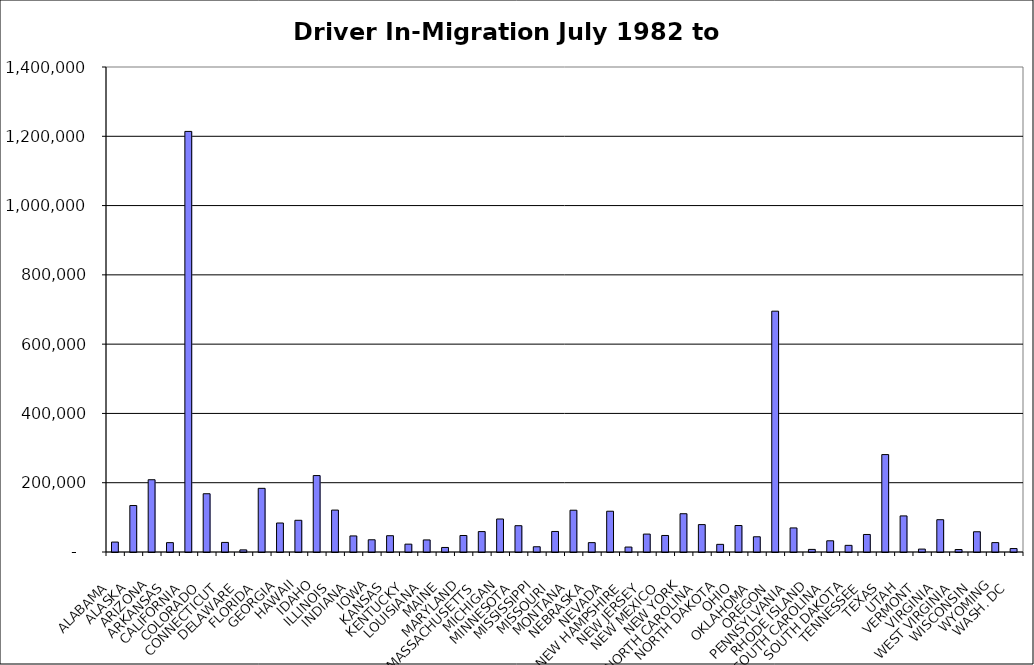
| Category | Series 0 |
|---|---|
|  ALABAMA  | 28679.5 |
|  ALASKA  | 134136.5 |
|  ARIZONA  | 208590 |
|  ARKANSAS  | 27023.5 |
|  CALIFORNIA  | 1214070.5 |
|  COLORADO  | 168181 |
|  CONNECTICUT  | 27652 |
|  DELAWARE  | 6131.5 |
|  FLORIDA  | 183751 |
|  GEORGIA  | 83703 |
|  HAWAII  | 91536.5 |
|  IDAHO  | 220633.5 |
|  ILLINOIS  | 120972.5 |
|  INDIANA  | 46371 |
|  IOWA  | 35278.5 |
|  KANSAS  | 47020.5 |
|  KENTUCKY  | 22666 |
|  LOUISIANA  | 34830.5 |
|  MAINE  | 13103.5 |
|  MARYLAND  | 47595 |
|  MASSACHUSETTS  | 58922 |
|  MICHIGAN  | 95300 |
|  MINNESOTA  | 75909.5 |
|  MISSISSIPPI  | 15127 |
|  MISSOURI  | 59276 |
|  MONTANA  | 120610 |
|  NEBRASKA  | 27030.5 |
|  NEVADA  | 117696 |
|  NEW HAMPSHIRE  | 14280.5 |
|  NEW JERSEY  | 51706 |
|  NEW MEXICO  | 47682 |
|  NEW YORK  | 110484 |
|  NORTH CAROLINA  | 79093.5 |
|  NORTH DAKOTA  | 22067.5 |
|  OHIO  | 76476.5 |
|  OKLAHOMA  | 43967 |
|  OREGON  | 695134 |
|  PENNSYLVANIA  | 69476.5 |
|  RHODE ISLAND  | 7525 |
|  SOUTH CAROLINA  | 32368.5 |
|  SOUTH DAKOTA  | 19201.5 |
|  TENNESSEE  | 50579.5 |
|  TEXAS  | 281181 |
|  UTAH  | 104187.5 |
|  VERMONT  | 8390 |
|  VIRGINIA  | 93211 |
|  WEST VIRGINIA  | 7082.5 |
|  WISCONSIN  | 58416.5 |
|  WYOMING  | 27125 |
|  WASH. DC  | 9952 |